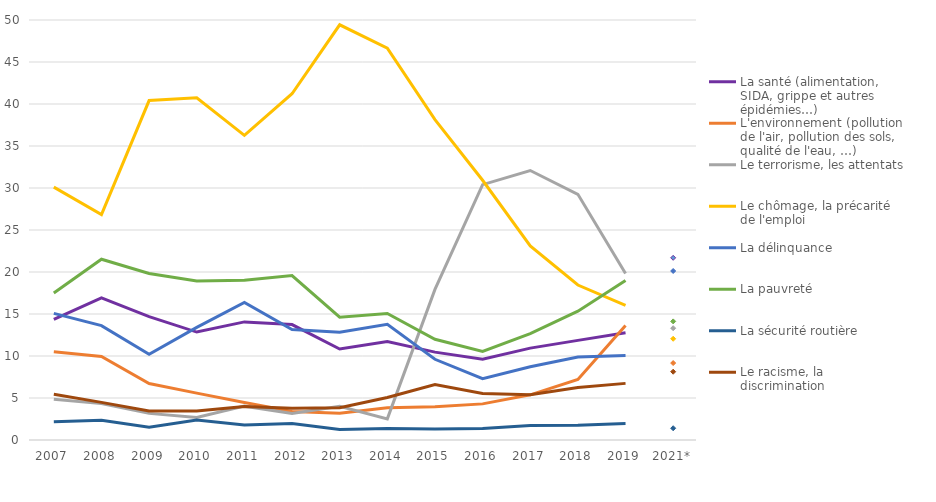
| Category | La santé (alimentation, SIDA, grippe et autres épidémies…) | L'environnement (pollution de l'air, pollution des sols, qualité de l'eau, …) | Le terrorisme, les attentats | Le chômage, la précarité de l'emploi | La délinquance | La pauvreté | La sécurité routière | Le racisme, la discrimination |
|---|---|---|---|---|---|---|---|---|
| 2007 | 14.36 | 10.5 | 4.85 | 30.1 | 15.07 | 17.51 | 2.16 | 5.45 |
| 2008 | 16.93 | 9.95 | 4.33 | 26.84 | 13.62 | 21.52 | 2.35 | 4.48 |
| 2009 | 14.68 | 6.73 | 3.17 | 40.41 | 10.21 | 19.83 | 1.52 | 3.45 |
| 2010 | 12.85 | 5.58 | 2.68 | 40.75 | 13.4 | 18.92 | 2.37 | 3.44 |
| 2011 | 14.06 | 4.46 | 4.03 | 36.26 | 16.38 | 19.03 | 1.79 | 3.98 |
| 2012 | 13.74 | 3.4 | 3.17 | 41.22 | 13.15 | 19.57 | 1.96 | 3.77 |
| 2013 | 10.83 | 3.18 | 4.02 | 49.43 | 12.84 | 14.62 | 1.24 | 3.85 |
| 2014 | 11.71 | 3.84 | 2.52 | 46.64 | 13.77 | 15.07 | 1.38 | 5.06 |
| 2015 | 10.46 | 3.97 | 17.93 | 38.14 | 9.61 | 11.99 | 1.3 | 6.6 |
| 2016 | 9.62 | 4.3 | 30.4 | 30.92 | 7.3 | 10.55 | 1.38 | 5.53 |
| 2017 | 10.94 | 5.38 | 32.08 | 23.11 | 8.71 | 12.67 | 1.72 | 5.39 |
| 2018 | 11.86 | 7.2 | 29.25 | 18.45 | 9.89 | 15.34 | 1.77 | 6.24 |
| 2019 | 12.771 | 13.644 | 19.814 | 16.037 | 10.048 | 18.978 | 1.973 | 6.741 |
| 2021* | 21.69 | 9.16 | 13.31 | 12.05 | 20.12 | 14.12 | 1.4 | 8.13 |